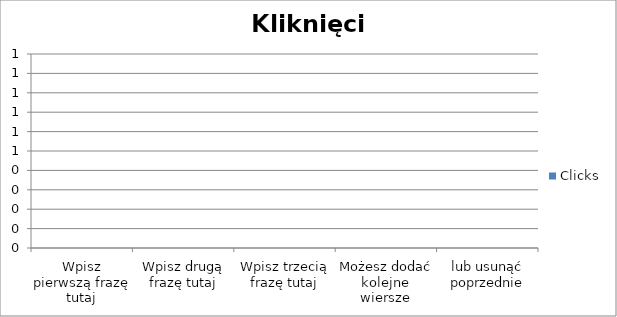
| Category | Clicks |
|---|---|
| Wpisz pierwszą frazę tutaj | 0 |
| Wpisz drugą frazę tutaj | 0 |
| Wpisz trzecią frazę tutaj | 0 |
| Możesz dodać kolejne wiersze | 0 |
| lub usunąć poprzednie | 0 |